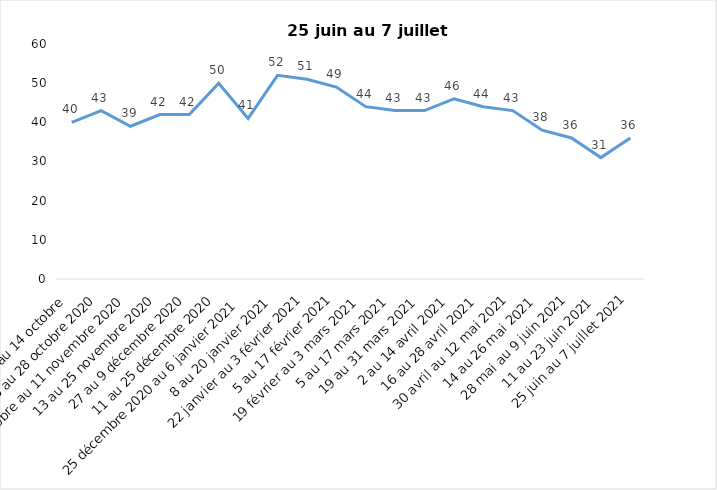
| Category | Toujours aux trois mesures |
|---|---|
| 2 au 14 octobre  | 40 |
| 16 au 28 octobre 2020 | 43 |
| 30 octobre au 11 novembre 2020 | 39 |
| 13 au 25 novembre 2020 | 42 |
| 27 au 9 décembre 2020 | 42 |
| 11 au 25 décembre 2020 | 50 |
| 25 décembre 2020 au 6 janvier 2021 | 41 |
| 8 au 20 janvier 2021 | 52 |
| 22 janvier au 3 février 2021 | 51 |
| 5 au 17 février 2021 | 49 |
| 19 février au 3 mars 2021 | 44 |
| 5 au 17 mars 2021 | 43 |
| 19 au 31 mars 2021 | 43 |
| 2 au 14 avril 2021 | 46 |
| 16 au 28 avril 2021 | 44 |
| 30 avril au 12 mai 2021 | 43 |
| 14 au 26 mai 2021 | 38 |
| 28 mai au 9 juin 2021 | 36 |
| 11 au 23 juin 2021 | 31 |
| 25 juin au 7 juillet 2021 | 36 |